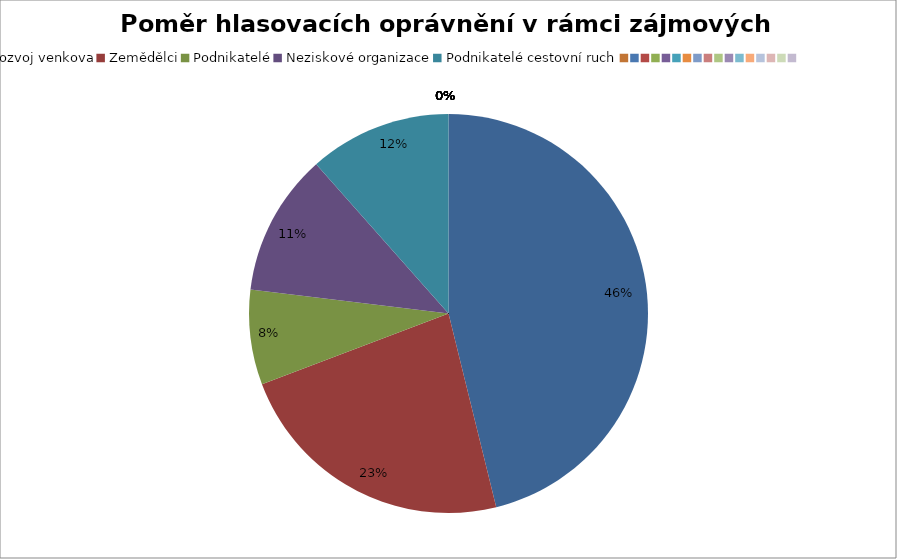
| Category | Series 0 |
|---|---|
| Rozvoj venkova | 0.462 |
| Zemědělci | 0.231 |
| Podnikatelé | 0.077 |
| Neziskové organizace | 0.115 |
| Podnikatelé cestovní ruch | 0.115 |